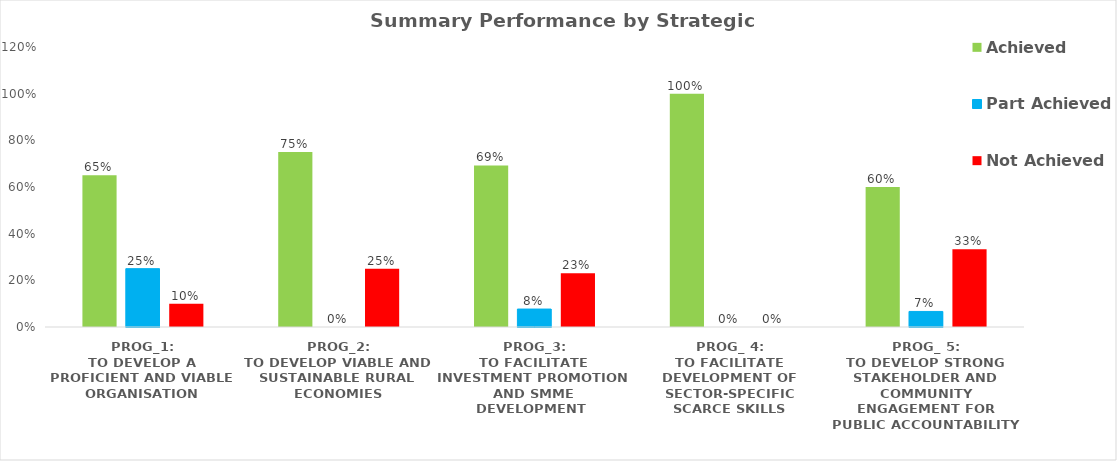
| Category | Achieved | Part Achieved | Not Achieved |
|---|---|---|---|
| PROG_1:
TO DEVELOP A PROFICIENT AND VIABLE ORGANISATION | 0.65 | 0.25 | 0.1 |
| PROG_2:
TO DEVELOP VIABLE AND SUSTAINABLE RURAL ECONOMIES | 0.75 | 0 | 0.25 |
| PROG_3:
TO FACILITATE INVESTMENT PROMOTION AND SMME DEVELOPMENT  | 0.692 | 0.077 | 0.231 |
| PROG_ 4:
TO FACILITATE DEVELOPMENT OF SECTOR-SPECIFIC SCARCE SKILLS | 1 | 0 | 0 |
| PROG_ 5:
TO DEVELOP STRONG STAKEHOLDER AND COMMUNITY ENGAGEMENT FOR PUBLIC ACCOUNTABILITY | 0.6 | 0.067 | 0.333 |